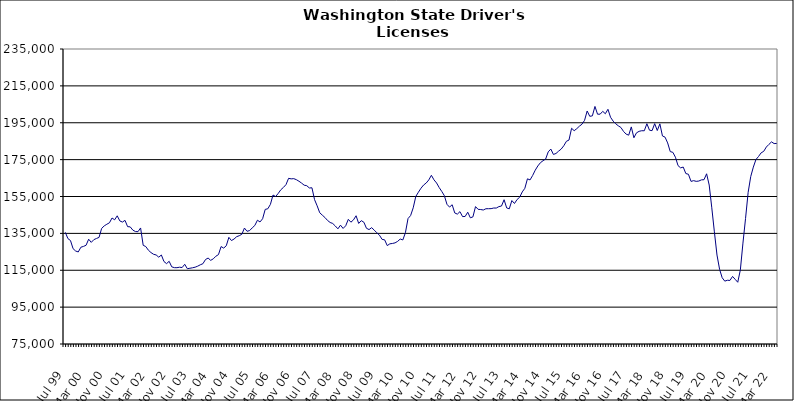
| Category | Series 0 |
|---|---|
| Jul 99 | 135560 |
| Aug 99 | 132182 |
| Sep 99 | 131104 |
| Oct 99 | 126694 |
| Nov 99 | 125425 |
| Dec 99 | 124927 |
| Jan 00 | 127499 |
| Feb 00 | 127927 |
| Mar 00 | 128547 |
| Apr 00 | 131834 |
| May 00 | 130120 |
| Jun 00 | 131595 |
| Jul 00 | 132236 |
| Aug 00 | 132819 |
| Sep 00 | 137711 |
| Oct 00 | 139063 |
| Nov 00 | 139952 |
| Dec 00 | 140732 |
| Jan 01 | 143338 |
| Feb 01 | 142359 |
| Mar 01 | 144523 |
| Apr 01 | 141758 |
| May 01 | 141135 |
| Jun 01 | 142064 |
| Jul 01 | 138646 |
| Aug 01 | 138530 |
| Sep 01 | 136784 |
| Oct 01 | 135996 |
| Nov 01 | 135917 |
| Dec 01 | 137940 |
| Jan 02 | 128531 |
| Feb 02 | 127848 |
| Mar 02 | 125876 |
| Apr 02 | 124595 |
| May 02 | 123660 |
| Jun 02 | 123282 |
| Jul 02 | 122089 |
| Aug 02 | 123279 |
| Sep 02 | 119727 |
| Oct 02 | 118588 |
| Nov 02 | 119854 |
| Dec 02 | 116851 |
| Jan 03 | 116407 |
| Feb 03 | 116382 |
| Mar 03 | 116648 |
| Apr 03 | 116471 |
| May 03 | 118231 |
| Jun 03 | 115831 |
| Jul 03 | 116082 |
| Aug 03 | 116341 |
| Sep 03 | 116653 |
| Oct 03 | 117212 |
| Nov 03 | 117962 |
| Dec 03 | 118542 |
| Jan 04 | 120817 |
| Feb 04 | 121617 |
| Mar 04 | 120369 |
| Apr 04 | 121200 |
| May 04 | 122609 |
| Jun 04 | 123484 |
| Jul 04 | 127844 |
| Aug 04 | 127025 |
| Sep 04 | 128273 |
| Oct 04 | 132853 |
| Nov 04 | 131106 |
| Dec 04 | 131935 |
| Jan 05 | 133205 |
| Feb 05 | 133736 |
| Mar 05 | 134528 |
| Apr 05 | 137889 |
| May 05 | 136130 |
| Jun 05 | 136523 |
| Jul 05 | 137997 |
| Aug 05 | 139294 |
| Sep 05 | 142140 |
| Oct 05 | 141192 |
| Nov 05 | 142937 |
| Dec 05 | 148013 |
| Jan 06 | 148341 |
| Feb 06 | 150744 |
| Mar 06 | 155794 |
| Apr 06 | 154984 |
| May 06 | 156651 |
| Jun 06 | 158638 |
| Jul 06 | 159911 |
| Aug 06 | 161445 |
| Sep 06 | 164852 |
| Oct 06 | 164570 |
| Nov 06 | 164679 |
| Dec 06 | 164127 |
| Jan 07 | 163271 |
| Feb 07 | 162273 |
| Mar 07 | 161140 |
| Apr 07 | 160860 |
| May 07 | 159633 |
| Jun 07 | 159724 |
| Jul 07 | 153303 |
| Aug 07 | 149939 |
| Sep 07 | 146172 |
| Oct 07 | 144876 |
| Nov 07 | 143613 |
| Dec 07 | 142022 |
| Jan 08 | 140909 |
| Feb 08 | 140368 |
| Mar 08 | 138998 |
| Apr 08 | 137471 |
| May 08 | 139453 |
| Jun 08 | 137680 |
| Jul 08 | 139120 |
| Aug 08 | 142612 |
| Sep-08 | 141071 |
| Oct 08 | 142313 |
| Nov 08 | 144556 |
| Dec 08 | 140394 |
| Jan 09 | 141903 |
| Feb 09 | 141036 |
| Mar 09 | 137751 |
| Apr 09 | 137060 |
| May 09 | 138101 |
| Jun 09 | 136739 |
| Jul 09 | 135317 |
| Aug 09 | 134020 |
| Sep 09 | 131756 |
| Oct 09 | 131488 |
| Nov 09 | 128370 |
| Dec 09 | 129323 |
| Jan 10 | 129531 |
| Feb 10 | 129848 |
| Mar 10 | 130654 |
| Apr 10 | 131929 |
| May 10 | 131429 |
| Jun 10 | 135357 |
| Jul 10 | 143032 |
| Aug 10 | 144686 |
| Sep 10 | 148856 |
| Oct 10 | 155042 |
| Nov 10 | 157328 |
| Dec 10 | 159501 |
| Jan 11 | 161221 |
| Feb 11 | 162312 |
| Mar 11 | 163996 |
| Apr 11 | 166495 |
| May 11 | 164040 |
| Jun 11 | 162324 |
| Jul 11 | 159862 |
| Aug 11 | 157738 |
| Sep 11 | 155430 |
| Oct 11 | 150762 |
| Nov 11 | 149255 |
| Dec 11 | 150533 |
| Jan 12 | 146068 |
| Feb 12 | 145446 |
| Mar 12 | 146788 |
| Apr 12 | 144110 |
| May 12 | 144162 |
| Jun 12 | 146482 |
| Jul 12 | 143445 |
| Aug 12 | 143950 |
| Sep 12 | 149520 |
| Oct 12 | 148033 |
| Nov 12 | 147926 |
| Dec 12 | 147674 |
| Jan 13 | 148360 |
| Feb-13 | 148388 |
| Mar-13 | 148414 |
| Apr 13 | 148749 |
| May 13 | 148735 |
| Jun-13 | 149521 |
| Jul 13 | 149837 |
| Aug 13 | 153252 |
| Sep 13 | 148803 |
| Oct 13 | 148315 |
| Nov 13 | 152804 |
| Dec 13 | 151209 |
| Jan 14 | 153357 |
| Feb-14 | 154608 |
| Mar 14 | 157479 |
| Apr 14 | 159441 |
| May 14 | 164591 |
| Jun 14 | 163995 |
| Jul-14 | 166411 |
| Aug-14 | 169272 |
| Sep 14 | 171565 |
| Oct 14 | 173335 |
| Nov 14 | 174406 |
| Dec 14 | 175302 |
| Jan 15 | 179204 |
| Feb 15 | 180737 |
| Mar 15 | 177810 |
| Apr-15 | 178331 |
| May 15 | 179601 |
| Jun-15 | 180729 |
| Jul 15 | 182540 |
| Aug 15 | 184924 |
| Sep 15 | 185620 |
| Oct 15 | 192002 |
| Nov 15 | 190681 |
| Dec 15 | 191795 |
| Jan 16 | 193132 |
| Feb 16 | 194206 |
| Mar 16 | 196319 |
| Apr 16 | 201373 |
| May 16 | 198500 |
| Jun 16 | 198743 |
| Jul 16 | 203841 |
| Aug 16 | 199630 |
| Sep 16 | 199655 |
| Oct 16 | 201181 |
| Nov 16 | 199888 |
| Dec 16 | 202304 |
| Jan 17 | 197977 |
| Feb 17 | 195889 |
| Mar 17 | 194438 |
| Apr 17 | 193335 |
| May 17 | 192430 |
| Jun 17 | 190298 |
| Jul 17 | 188832 |
| Aug 17 | 188264 |
| Sep 17 | 192738 |
| Oct 17 | 186856 |
| Nov 17 | 189537 |
| Dec 17 | 190341 |
| Jan 18 | 190670 |
| Feb 18 | 190645 |
| Mar 18 | 194476 |
| Apr 18 | 190971 |
| May 18 | 190707 |
| Jun 18 | 194516 |
| Jul 18 | 190783 |
| Aug 18 | 194390 |
| Sep 18 | 187831 |
| Oct 18 | 187188 |
| Nov 18 | 184054 |
| Dec 18 | 179347 |
| Jan 19 | 178958 |
| Feb 19 | 176289 |
| Mar 19 | 171747 |
| Apr 19 | 170532 |
| May 19 | 170967 |
| Jun 19 | 167444 |
| Jul 19 | 167059 |
| Aug 19 | 163194 |
| Sep 19 | 163599 |
| Oct 19 | 163212 |
| Nov 19 | 163388 |
| Dec 19 | 164024 |
| Jan 20 | 164114 |
| Feb 20 | 167320 |
| Mar 20 | 161221 |
| Apr 20 | 148866 |
| May 20 | 135821 |
| Jun 20 | 123252 |
| Jul 20 | 115526 |
| Aug 20 | 110940 |
| Sep 20 | 109099 |
| Oct 20 | 109566 |
| Nov 20 | 109488 |
| Dec 20 | 111658 |
| Jan 21 | 110070 |
| Feb 21 | 108491 |
| Mar 21 | 115176 |
| Apr 21 | 129726 |
| May 21 | 143052 |
| Jun 21 | 157253 |
| Jul 21 | 165832 |
| Aug 21 | 170937 |
| Sep 21 | 175042 |
| Oct 21 | 176696 |
| Nov 21 | 178677 |
| Dec 21 | 179501 |
| Jan 22 | 181825 |
| Feb 22 | 183258 |
| Mar 22 | 184618 |
| Apr 22 | 183710 |
| May 22 | 183784 |